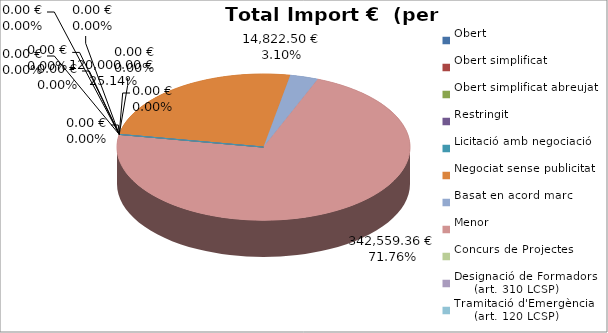
| Category | Total preu
(amb IVA) |
|---|---|
| Obert | 0 |
| Obert simplificat | 0 |
| Obert simplificat abreujat | 0 |
| Restringit | 0 |
| Licitació amb negociació | 0 |
| Negociat sense publicitat | 120000 |
| Basat en acord marc | 14822.5 |
| Menor | 342559.36 |
| Concurs de Projectes | 0 |
| Designació de Formadors
     (art. 310 LCSP) | 0 |
| Tramitació d'Emergència
     (art. 120 LCSP) | 0 |